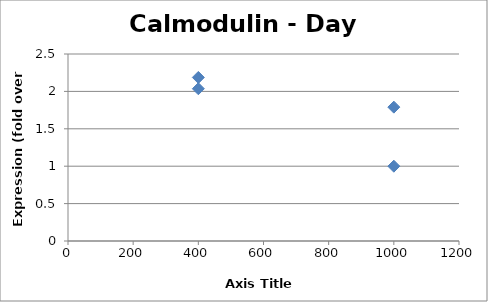
| Category | Series 0 |
|---|---|
| 1000.0 | 1.789 |
| 1000.0 | 1 |
| 400.0 | 2.036 |
| 400.0 | 2.187 |